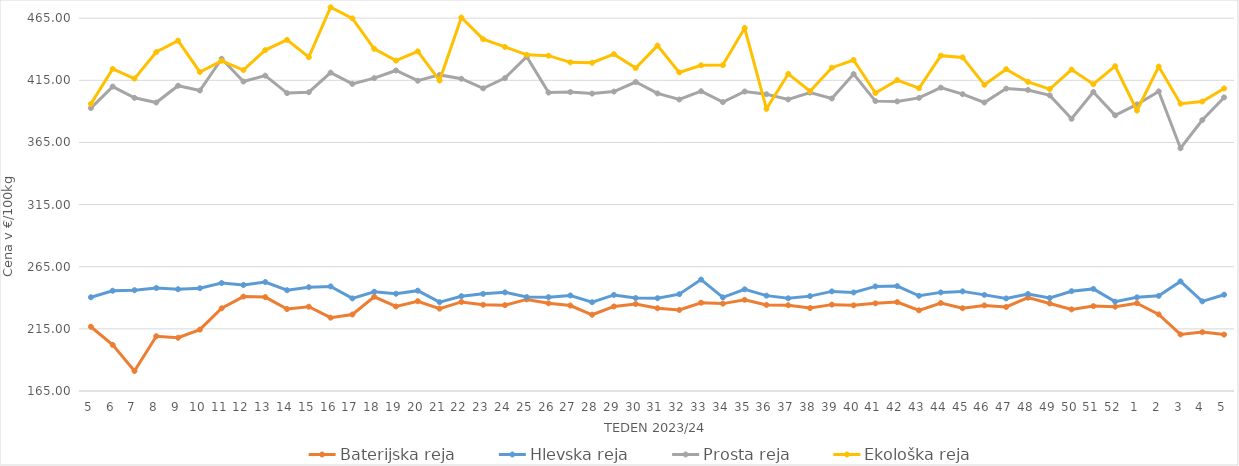
| Category | Baterijska reja | Hlevska reja | Prosta reja | Ekološka reja |
|---|---|---|---|---|
| 5.0 | 216.7 | 240.42 | 392.67 | 396.03 |
| 6.0 | 202.1 | 245.67 | 409.97 | 424.14 |
| 7.0 | 181.11 | 246.12 | 400.94 | 416.38 |
| 8.0 | 209.08 | 247.88 | 397.11 | 437.76 |
| 9.0 | 207.87 | 246.89 | 410.64 | 446.9 |
| 10.0 | 214.42 | 247.73 | 406.8 | 421.72 |
| 11.0 | 231.56 | 251.88 | 432.34 | 430.69 |
| 12.0 | 240.97 | 250.3 | 414 | 423.28 |
| 13.0 | 240.55 | 252.7 | 418.74 | 439.31 |
| 14.0 | 230.99 | 246.12 | 404.72 | 447.59 |
| 15.0 | 232.82 | 248.56 | 405.42 | 433.62 |
| 16.0 | 224 | 249.17 | 421.22 | 473.79 |
| 17.0 | 226.57 | 239.5 | 412.13 | 464.83 |
| 18.0 | 240.83 | 244.89 | 416.74 | 440.35 |
| 19.0 | 233.05 | 243.26 | 422.93 | 430.86 |
| 20.0 | 237.25 | 245.73 | 414.68 | 438.28 |
| 21.0 | 231.3 | 236.5 | 419.36 | 414.83 |
| 22.0 | 236.67 | 241.27 | 416.27 | 465.52 |
| 23.0 | 234.39 | 243.16 | 408.53 | 448.1 |
| 24.0 | 234.08 | 244.37 | 416.78 | 441.9 |
| 25.0 | 238.69 | 240.6 | 434.05 | 435.52 |
| 26.0 | 235.57 | 240.51 | 405.15 | 434.83 |
| 27.0 | 233.75 | 241.89 | 405.58 | 429.48 |
| 28.0 | 226.35 | 236.46 | 404.32 | 429.14 |
| 29.0 | 233.03 | 242.31 | 405.96 | 436.04 |
| 30.0 | 235 | 239.8 | 413.63 | 424.83 |
| 31.0 | 231.55 | 239.67 | 404.46 | 442.93 |
| 32.0 | 230.2 | 242.89 | 399.57 | 421.38 |
| 33.0 | 236.04 | 254.68 | 406.23 | 427.07 |
| 34.0 | 235.32 | 240.35 | 397.45 | 427.24 |
| 35.0 | 238.39 | 246.82 | 406 | 457.07 |
| 36.0 | 234.27 | 241.75 | 403.79 | 392.07 |
| 37.0 | 234 | 239.58 | 399.61 | 420.17 |
| 38.0 | 231.74 | 241.34 | 405.14 | 406.21 |
| 39.0 | 234.5 | 245.15 | 400.39 | 425.17 |
| 40.0 | 233.92 | 244.29 | 420.04 | 431.38 |
| 41.0 | 235.54 | 249.18 | 398.28 | 404.83 |
| 42.0 | 236.54 | 249.42 | 398.03 | 415.17 |
| 43.0 | 229.92 | 241.62 | 400.86 | 408.62 |
| 44.0 | 235.77 | 244.36 | 409.1 | 434.83 |
| 45.0 | 231.6 | 245.16 | 403.86 | 433.45 |
| 46.0 | 233.89 | 242.36 | 397.17 | 411.38 |
| 47.0 | 232.62 | 239.48 | 408.34 | 423.97 |
| 48.0 | 240.11 | 243.04 | 407.25 | 413.79 |
| 49.0 | 235.41 | 239.81 | 402.87 | 407.93 |
| 50.0 | 230.65 | 245.3 | 384.02 | 423.62 |
| 51.0 | 233.3 | 247.16 | 405.6 | 411.9 |
| 52.0 | 232.85 | 236.91 | 386.82 | 426.38 |
| 1.0 | 235.66 | 240.38 | 395.59 | 390.69 |
| 2.0 | 226.65 | 241.59 | 406.11 | 426.03 |
| 3.0 | 210.5 | 253.21 | 360.35 | 396.21 |
| 4.0 | 212.37 | 237.14 | 383.09 | 397.93 |
| 5.0 | 210.38 | 242.47 | 401.23 | 408.45 |